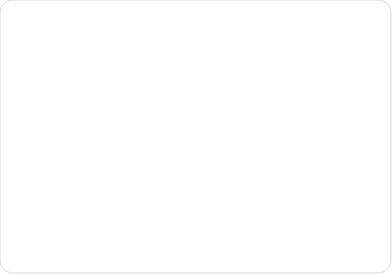
| Category | Series 0 |
|---|---|
| 0 | 13 |
| 1 | 8 |
| 2 | 6 |
| 3 | 5 |
| 4 | 3 |
| 5 | 3 |
| 6 | 2 |